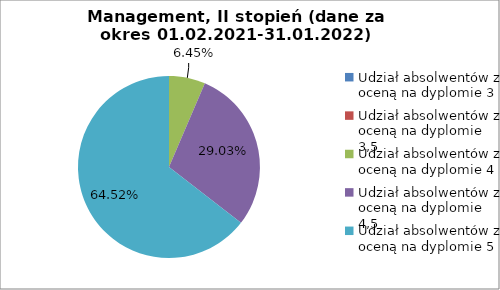
| Category | Series 0 |
|---|---|
| Udział absolwentów z oceną na dyplomie 3 | 0 |
| Udział absolwentów z oceną na dyplomie 3,5 | 0 |
| Udział absolwentów z oceną na dyplomie 4 | 6.452 |
| Udział absolwentów z oceną na dyplomie 4,5 | 29.032 |
| Udział absolwentów z oceną na dyplomie 5 | 64.516 |